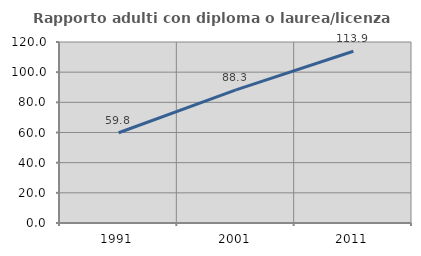
| Category | Rapporto adulti con diploma o laurea/licenza media  |
|---|---|
| 1991.0 | 59.821 |
| 2001.0 | 88.261 |
| 2011.0 | 113.853 |